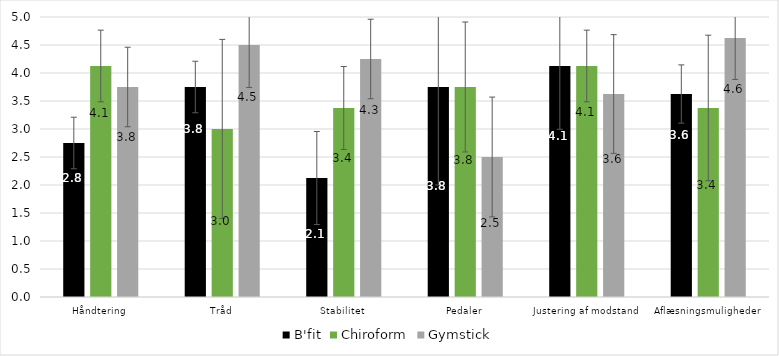
| Category | B'fit | Chiroform | Gymstick |
|---|---|---|---|
| Håndtering | 2.75 | 4.125 | 3.75 |
| Tråd | 3.75 | 3 | 4.5 |
| Stabilitet | 2.125 | 3.375 | 4.25 |
| Pedaler | 3.75 | 3.75 | 2.5 |
| Justering af modstand | 4.125 | 4.125 | 3.625 |
| Aflæsningsmuligheder | 3.625 | 3.375 | 4.625 |